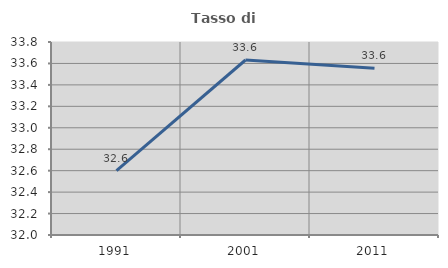
| Category | Tasso di occupazione   |
|---|---|
| 1991.0 | 32.601 |
| 2001.0 | 33.632 |
| 2011.0 | 33.554 |